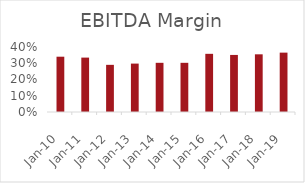
| Category | EBITDA % |
|---|---|
| 2010-03-31 | 0.34 |
| 2011-03-31 | 0.335 |
| 2012-03-31 | 0.29 |
| 2013-03-31 | 0.298 |
| 2014-03-31 | 0.303 |
| 2015-03-31 | 0.303 |
| 2016-03-31 | 0.358 |
| 2017-03-31 | 0.351 |
| 2018-03-31 | 0.355 |
| 2019-03-31 | 0.365 |